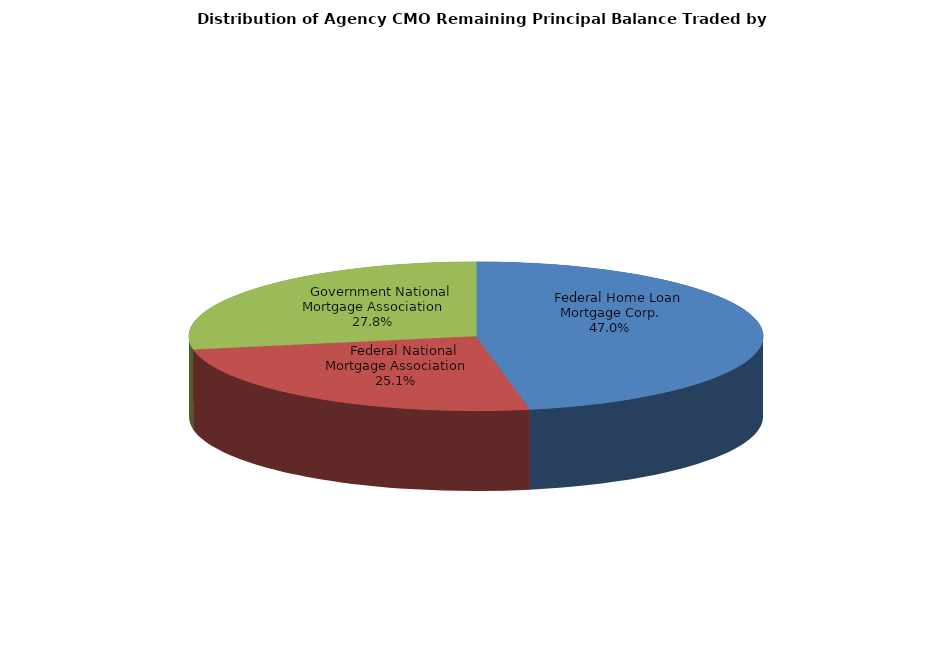
| Category | Series 0 |
|---|---|
|     Federal Home Loan Mortgage Corp. | 1868133735.286 |
|     Federal National Mortgage Association | 999343461.408 |
|     Government National Mortgage Association | 1106393961.888 |